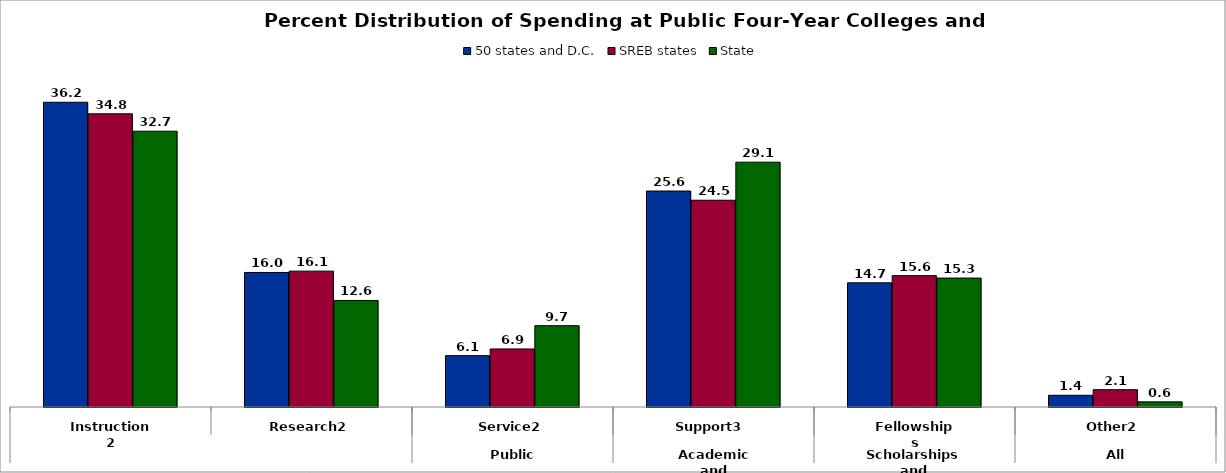
| Category | 50 states and D.C. | SREB states | State |
|---|---|---|---|
| 0 | 36.17 | 34.798 | 32.734 |
| 1 | 15.969 | 16.127 | 12.645 |
| 2 | 6.094 | 6.887 | 9.652 |
| 3 | 25.635 | 24.541 | 29.057 |
| 4 | 14.74 | 15.593 | 15.302 |
| 5 | 1.391 | 2.054 | 0.609 |